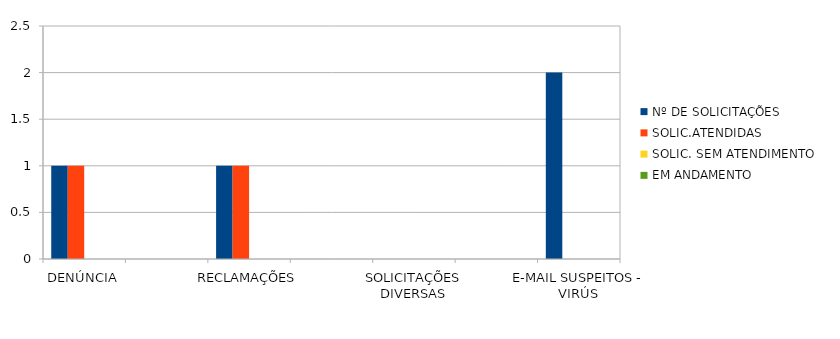
| Category | Nº DE SOLICITAÇÕES | SOLIC.ATENDIDAS | SOLIC. SEM ATENDIMENTO | EM ANDAMENTO |
|---|---|---|---|---|
| DENÚNCIA | 1 | 1 | 0 | 0 |
| DÚVIDA | 0 | 0 | 0 | 0 |
| RECLAMAÇÕES | 1 | 1 | 0 | 0 |
| PEDIDO DE ACESSO À INFORMAÇÃO | 0 | 0 | 0 | 0 |
| SOLICITAÇÕES DIVERSAS | 0 | 0 | 0 | 0 |
| SUGESTÃO  | 0 | 0 | 0 | 0 |
| E-MAIL SUSPEITOS - VIRÚS | 2 | 0 | 0 | 0 |